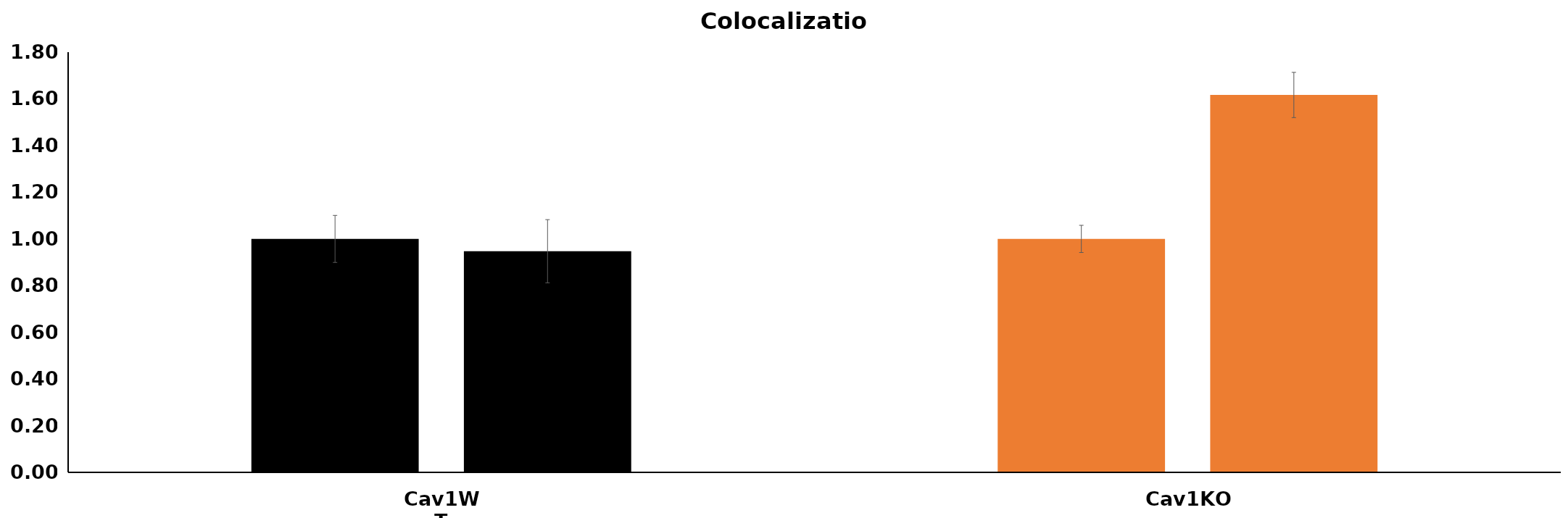
| Category | Control | siHOOK1 |
|---|---|---|
| Cav1WT | 1 | 0.947 |
| Cav1KO | 1 | 1.617 |